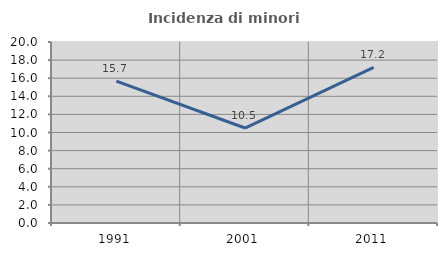
| Category | Incidenza di minori stranieri |
|---|---|
| 1991.0 | 15.686 |
| 2001.0 | 10.494 |
| 2011.0 | 17.194 |